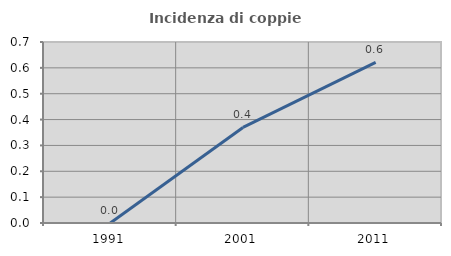
| Category | Incidenza di coppie miste |
|---|---|
| 1991.0 | 0 |
| 2001.0 | 0.37 |
| 2011.0 | 0.621 |